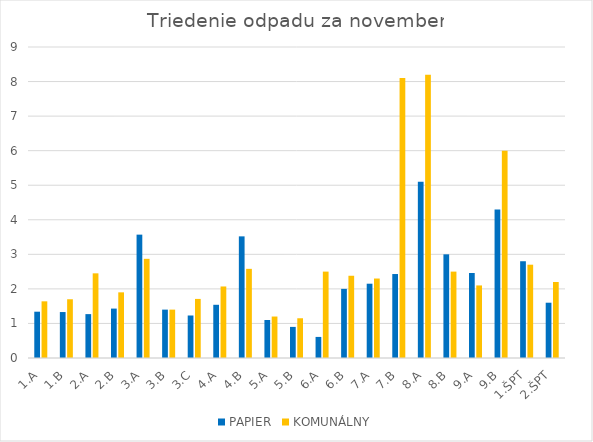
| Category | PAPIER | KOMUNÁLNY |
|---|---|---|
| 1.A | 1.34 | 1.64 |
| 1.B | 1.33 | 1.7 |
| 2.A | 1.27 | 2.45 |
| 2.B | 1.43 | 1.9 |
| 3.A | 3.57 | 2.87 |
| 3.B | 1.4 | 1.4 |
| 3.C | 1.23 | 1.71 |
| 4.A | 1.54 | 2.07 |
| 4.B | 3.52 | 2.58 |
| 5.A | 1.1 | 1.2 |
| 5.B | 0.9 | 1.15 |
| 6.A | 0.61 | 2.5 |
| 6.B | 2 | 2.38 |
| 7.A | 2.15 | 2.3 |
| 7.B | 2.43 | 8.1 |
| 8.A | 5.1 | 8.2 |
| 8.B | 3 | 2.5 |
| 9.A | 2.46 | 2.1 |
| 9.B | 4.3 | 6 |
| 1.ŠPT | 2.8 | 2.7 |
| 2.ŠPT | 1.6 | 2.2 |